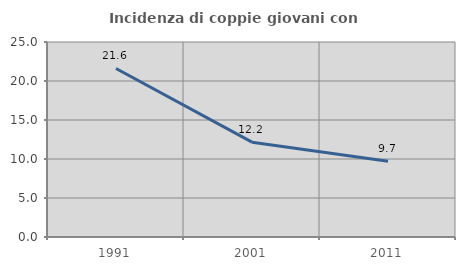
| Category | Incidenza di coppie giovani con figli |
|---|---|
| 1991.0 | 21.606 |
| 2001.0 | 12.155 |
| 2011.0 | 9.71 |